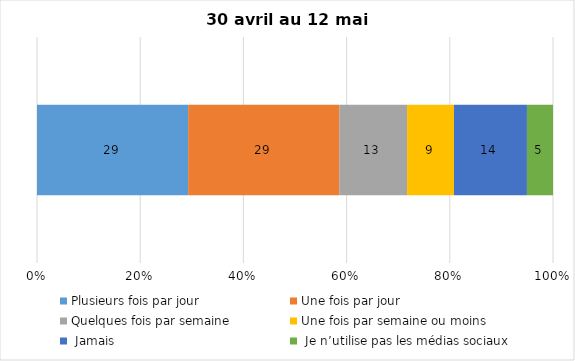
| Category | Plusieurs fois par jour | Une fois par jour | Quelques fois par semaine   | Une fois par semaine ou moins   |  Jamais   |  Je n’utilise pas les médias sociaux |
|---|---|---|---|---|---|---|
| 0 | 29 | 29 | 13 | 9 | 14 | 5 |